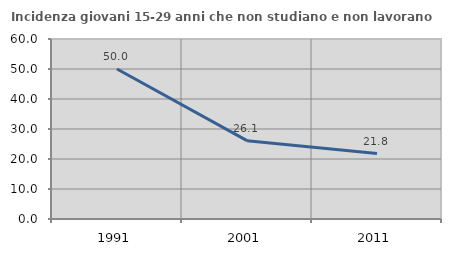
| Category | Incidenza giovani 15-29 anni che non studiano e non lavorano  |
|---|---|
| 1991.0 | 50 |
| 2001.0 | 26.119 |
| 2011.0 | 21.795 |